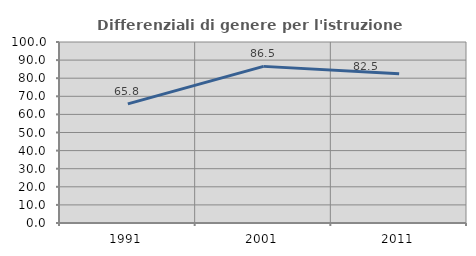
| Category | Differenziali di genere per l'istruzione superiore |
|---|---|
| 1991.0 | 65.808 |
| 2001.0 | 86.532 |
| 2011.0 | 82.485 |